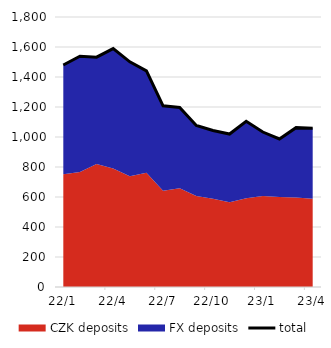
| Category | total |
|---|---|
| 2022-01-31 | 1479.746 |
| 2022-02-28 | 1538.154 |
| 2022-03-31 | 1532.45 |
| 2022-04-30 | 1589.362 |
| 2022-05-31 | 1501.328 |
| 2022-06-30 | 1441.246 |
| 2022-07-31 | 1207.672 |
| 2022-08-31 | 1197.189 |
| 2022-09-30 | 1077.34 |
| 2022-10-31 | 1043.138 |
| 2022-11-30 | 1019.847 |
| 2022-12-31 | 1105.122 |
| 2023-01-31 | 1033.251 |
| 2023-02-28 | 987.091 |
| 2023-03-31 | 1062.435 |
| 2023-04-30 | 1057.623 |